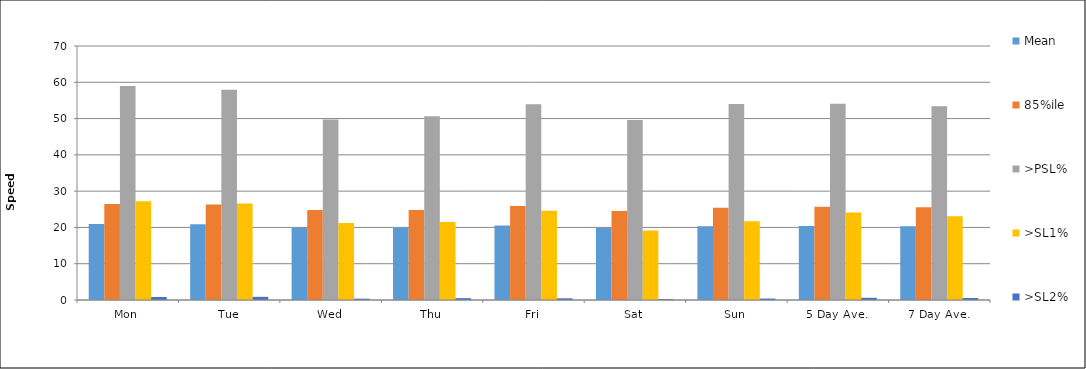
| Category | Mean | 85%ile | >PSL% | >SL1% | >SL2% |
|---|---|---|---|---|---|
| Mon | 20.973 | 26.466 | 58.964 | 27.22 | 0.822 |
| Tue | 20.86 | 26.321 | 57.924 | 26.624 | 0.872 |
| Wed | 19.909 | 24.803 | 49.71 | 21.232 | 0.362 |
| Thu | 20.011 | 24.814 | 50.649 | 21.501 | 0.505 |
| Fri | 20.512 | 25.911 | 53.947 | 24.613 | 0.464 |
| Sat | 19.824 | 24.53 | 49.63 | 19.177 | 0.247 |
| Sun | 20.301 | 25.438 | 54.046 | 21.678 | 0.4 |
| 5 Day Ave. | 20.4 | 25.715 | 54.093 | 24.101 | 0.612 |
| 7 Day Ave. | 20.332 | 25.536 | 53.397 | 23.102 | 0.56 |